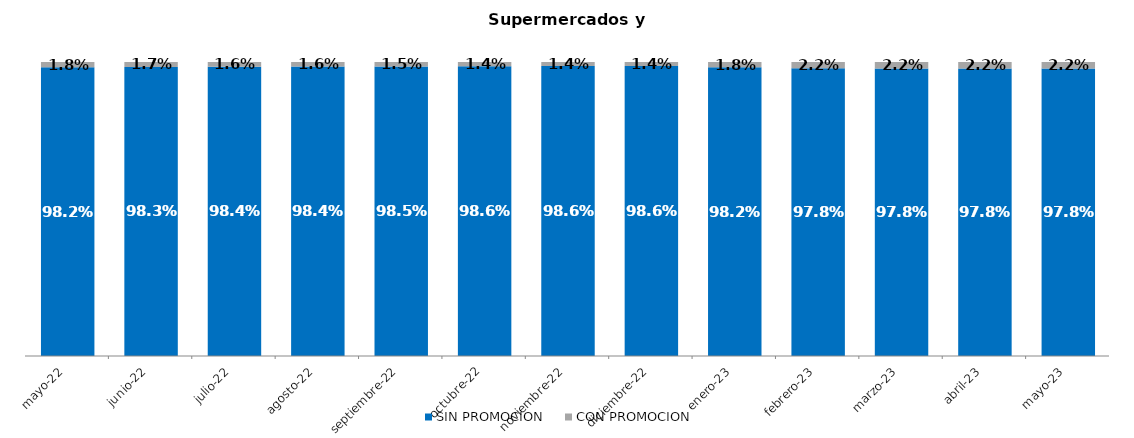
| Category | SIN PROMOCION   | CON PROMOCION   |
|---|---|---|
| 2022-05-01 | 0.982 | 0.018 |
| 2022-06-01 | 0.983 | 0.017 |
| 2022-07-01 | 0.984 | 0.016 |
| 2022-08-01 | 0.984 | 0.016 |
| 2022-09-01 | 0.985 | 0.015 |
| 2022-10-01 | 0.986 | 0.014 |
| 2022-11-01 | 0.986 | 0.014 |
| 2022-12-01 | 0.986 | 0.014 |
| 2023-01-01 | 0.982 | 0.018 |
| 2023-02-01 | 0.978 | 0.022 |
| 2023-03-01 | 0.978 | 0.022 |
| 2023-04-01 | 0.978 | 0.022 |
| 2023-05-01 | 0.978 | 0.022 |